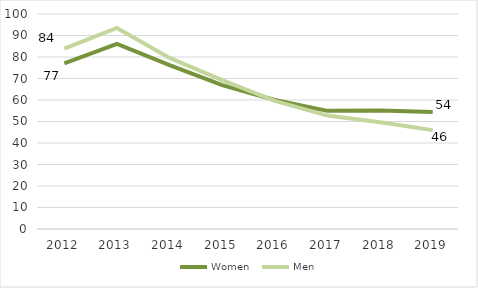
| Category | Women | Men |
|---|---|---|
| 2012.0 | 76.988 | 83.915 |
| 2013.0 | 86.068 | 93.489 |
| 2014.0 | 76.261 | 79.579 |
| 2015.0 | 66.948 | 69.226 |
| 2016.0 | 60.009 | 59.561 |
| 2017.0 | 54.949 | 52.754 |
| 2018.0 | 55.124 | 49.615 |
| 2019.0 | 54.458 | 45.997 |